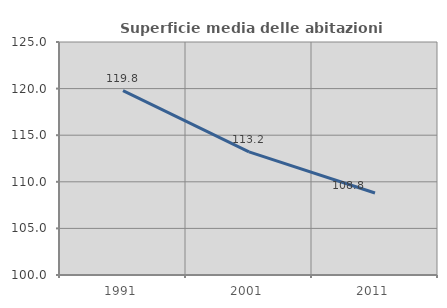
| Category | Superficie media delle abitazioni occupate |
|---|---|
| 1991.0 | 119.774 |
| 2001.0 | 113.212 |
| 2011.0 | 108.798 |